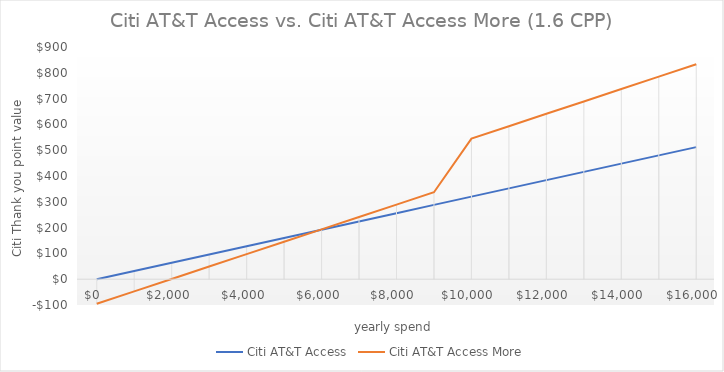
| Category | Citi AT&T Access | Citi AT&T Access More |
|---|---|---|
| 0.0 | 0 | -95 |
| 1000.0 | 32 | -47 |
| 2000.0 | 64 | 1 |
| 3000.0 | 96 | 49 |
| 4000.0 | 128 | 97 |
| 5000.0 | 160 | 145 |
| 6000.0 | 192 | 193 |
| 7000.0 | 224 | 241 |
| 8000.0 | 256 | 289 |
| 9000.0 | 288 | 337 |
| 10000.0 | 320 | 545 |
| 11000.0 | 352 | 593 |
| 12000.0 | 384 | 641 |
| 13000.0 | 416 | 689 |
| 14000.0 | 448 | 737 |
| 15000.0 | 480 | 785 |
| 16000.0 | 512 | 833 |